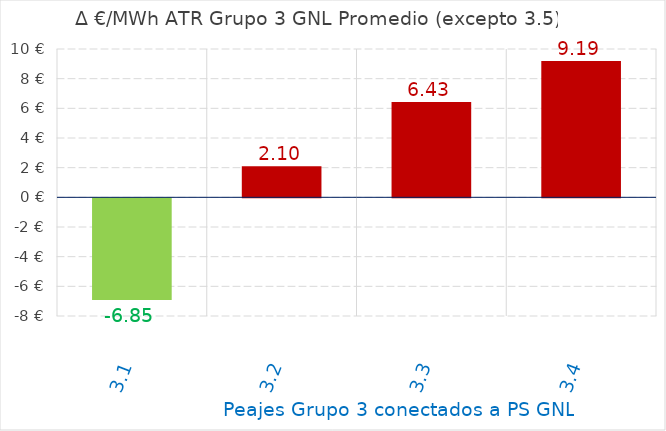
| Category | D €/MWh |
|---|---|
| 3.1 | -6.847 |
| 3.2 | 2.099 |
| 3.3 | 6.434 |
| 3.4 | 9.185 |